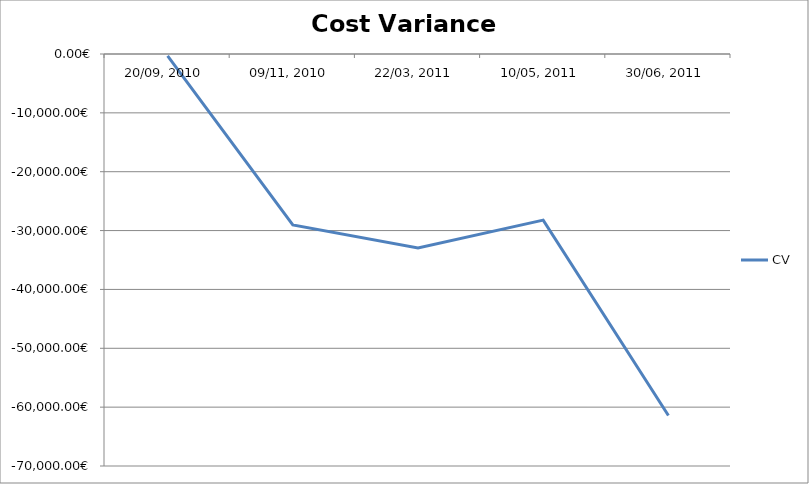
| Category | CV |
|---|---|
| 20/09, 2010 | -320.65 |
| 09/11, 2010 | -29034.921 |
| 22/03, 2011 | -32952.941 |
| 10/05, 2011 | -28230.099 |
| 30/06, 2011 | -61413.179 |